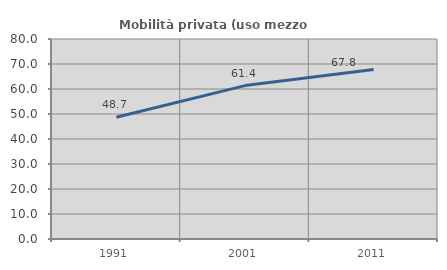
| Category | Mobilità privata (uso mezzo privato) |
|---|---|
| 1991.0 | 48.723 |
| 2001.0 | 61.359 |
| 2011.0 | 67.782 |